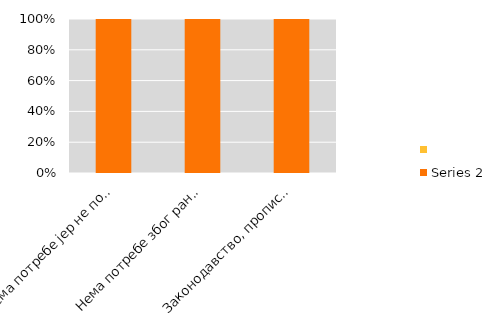
| Category | Series 2 | Series 1 |
|---|---|---|
| Нема потребе јер не постоји тражња за иновацијама | 12.536 |  |
| Нема потребе због ранијих иновација предузећа | 4.407 |  |
| Законодавство, прописи, стандарди, порези | 32.481 |  |